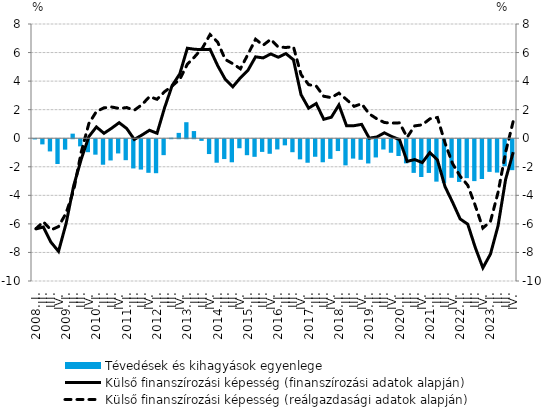
| Category | Tévedések és kihagyások egyenlege |
|---|---|
| 2008. I. | -0.014 |
| II. | -0.362 |
| III. | -0.855 |
| IV. | -1.735 |
| 2009. I. | -0.73 |
| II. | 0.32 |
| III. | -0.501 |
| IV. | -0.908 |
| 2010. I. | -1.082 |
| II. | -1.786 |
| III. | -1.488 |
| IV. | -0.996 |
| 2011. I. | -1.468 |
| II. | -2.046 |
| III. | -2.125 |
| IV. | -2.352 |
| 2012. I. | -2.38 |
| II. | -1.116 |
| III. | 0.036 |
| IV. | 0.374 |
| 2013. I. | 1.122 |
| II. | 0.502 |
| III. | -0.116 |
| IV. | -1.039 |
| 2014. I. | -1.646 |
| II. | -1.389 |
| III. | -1.616 |
| IV. | -0.631 |
| 2015. I. | -1.119 |
| II. | -1.233 |
| III. | -0.888 |
| IV. | -1.02 |
| 2016. I. | -0.716 |
| II. | -0.428 |
| III. | -0.909 |
| IV. | -1.41 |
| 2017. I. | -1.647 |
| II. | -1.229 |
| III. | -1.614 |
| IV. | -1.375 |
| 2018. I. | -0.828 |
| II. | -1.831 |
| III. | -1.356 |
| IV. | -1.442 |
| 2019. I. | -1.698 |
| II. | -1.277 |
| III. | -0.72 |
| IV. | -0.948 |
| 2020. I. | -1.173 |
| II. | -1.692 |
| III. | -2.358 |
| IV. | -2.646 |
| 2021. I. | -2.362 |
| II. | -2.971 |
| III. | -3.061 |
| IV. | -2.701 |
| 2022. I. | -2.992 |
| II. | -2.726 |
| III. | -2.934 |
| IV. | -2.786 |
| 2023. I. | -2.287 |
| II. | -2.338 |
| III. | -1.893 |
| IV. | -2.166 |